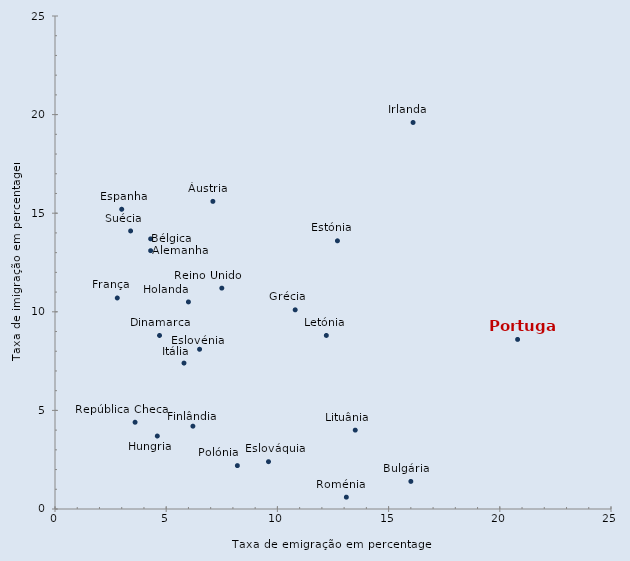
| Category | Series 0 |
|---|---|
| 7.1 | 15.6 |
| 4.3 | 13.7 |
| 16.0 | 1.4 |
| 3.6 | 4.4 |
| 4.7 | 8.8 |
| 12.7 | 13.6 |
| 6.2 | 4.2 |
| 2.8 | 10.7 |
| 4.3 | 13.1 |
| 10.8 | 10.1 |
| 4.6 | 3.7 |
| 16.1 | 19.6 |
| 5.8 | 7.4 |
| 12.2 | 8.8 |
| 13.5 | 4 |
| 6.0 | 10.5 |
| 8.2 | 2.2 |
| 20.8 | 8.6 |
| 13.1 | 0.6 |
| 9.6 | 2.4 |
| 6.5 | 8.1 |
| 3.0 | 15.2 |
| 3.4 | 14.1 |
| 7.5 | 11.2 |